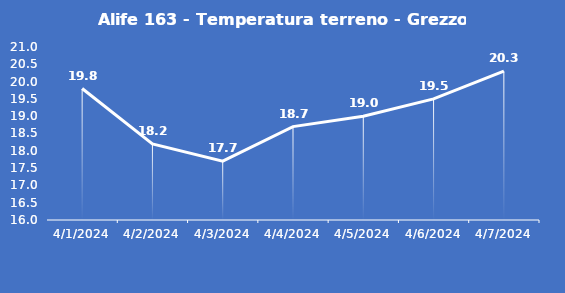
| Category | Alife 163 - Temperatura terreno - Grezzo (°C) |
|---|---|
| 4/1/24 | 19.8 |
| 4/2/24 | 18.2 |
| 4/3/24 | 17.7 |
| 4/4/24 | 18.7 |
| 4/5/24 | 19 |
| 4/6/24 | 19.5 |
| 4/7/24 | 20.3 |